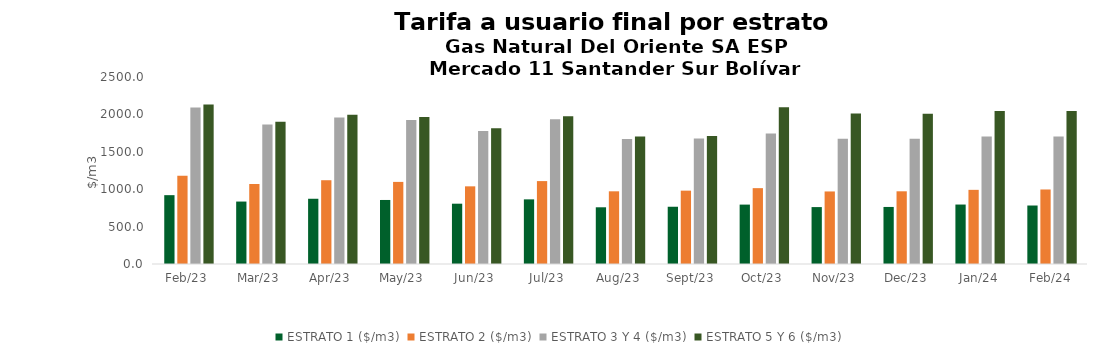
| Category | ESTRATO 1 ($/m3) | ESTRATO 2 ($/m3) | ESTRATO 3 Y 4 ($/m3) | ESTRATO 5 Y 6 ($/m3) |
|---|---|---|---|---|
| 2023-02-01 | 920.36 | 1179.08 | 2091.73 | 2133.565 |
| 2023-03-01 | 834.84 | 1069.75 | 1864.96 | 1902.259 |
| 2023-04-01 | 872.23 | 1119.98 | 1956.98 | 1996.12 |
| 2023-05-01 | 856.04 | 1097.58 | 1926.46 | 1964.989 |
| 2023-06-01 | 806.28 | 1038.3 | 1778.05 | 1813.611 |
| 2023-07-01 | 864.11 | 1108.42 | 1935.47 | 1974.179 |
| 2023-08-01 | 758.17 | 971.8 | 1672.03 | 1705.471 |
| 2023-09-01 | 765.41 | 980.53 | 1679.03 | 1712.611 |
| 2023-10-01 | 794.12 | 1014.06 | 1746.12 | 2095.344 |
| 2023-11-01 | 760.84 | 969.81 | 1675.45 | 2010.54 |
| 2023-12-01 | 762.7 | 971.9 | 1675 | 2010 |
| 2024-01-01 | 794.89 | 991.4 | 1705.82 | 2046.984 |
| 2024-02-01 | 781.94 | 996.24 | 1705.82 | 2046.984 |